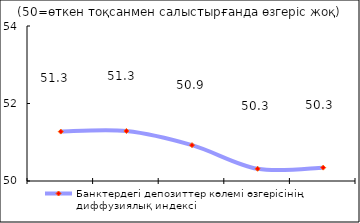
| Category | Банктердегі депозиттер көлемі өзгерісінің диффузиялық индексі |
|---|---|
| 0 | 51.275 |
| 1 | 51.29 |
| 2 | 50.925 |
| 3 | 50.315 |
| 4 | 50.345 |